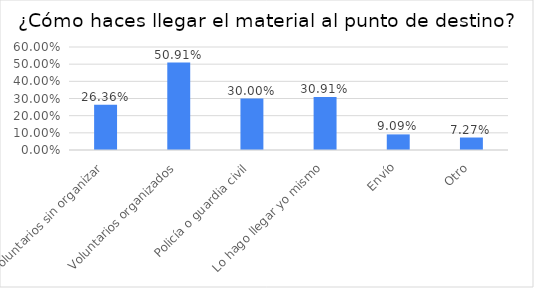
| Category | Series 0 |
|---|---|
| Voluntarios sin organizar | 0.264 |
| Voluntarios organizados | 0.509 |
| Policía o guardia civil | 0.3 |
| Lo hago llegar yo mismo | 0.309 |
| Envío | 0.091 |
| Otro | 0.073 |